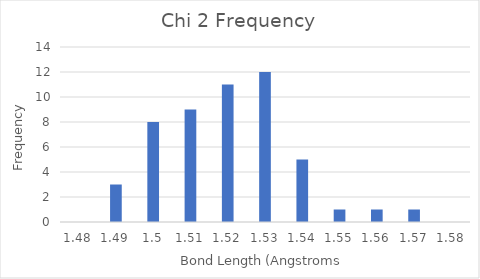
| Category | Chi 2 |
|---|---|
| 1.48 | 0 |
| 1.49 | 3 |
| 1.5 | 8 |
| 1.51 | 9 |
| 1.52 | 11 |
| 1.53 | 12 |
| 1.54 | 5 |
| 1.55 | 1 |
| 1.56 | 1 |
| 1.57 | 1 |
| 1.58 | 0 |